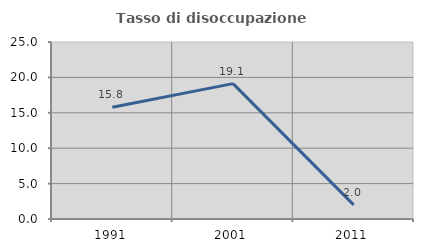
| Category | Tasso di disoccupazione giovanile  |
|---|---|
| 1991.0 | 15.789 |
| 2001.0 | 19.118 |
| 2011.0 | 2 |